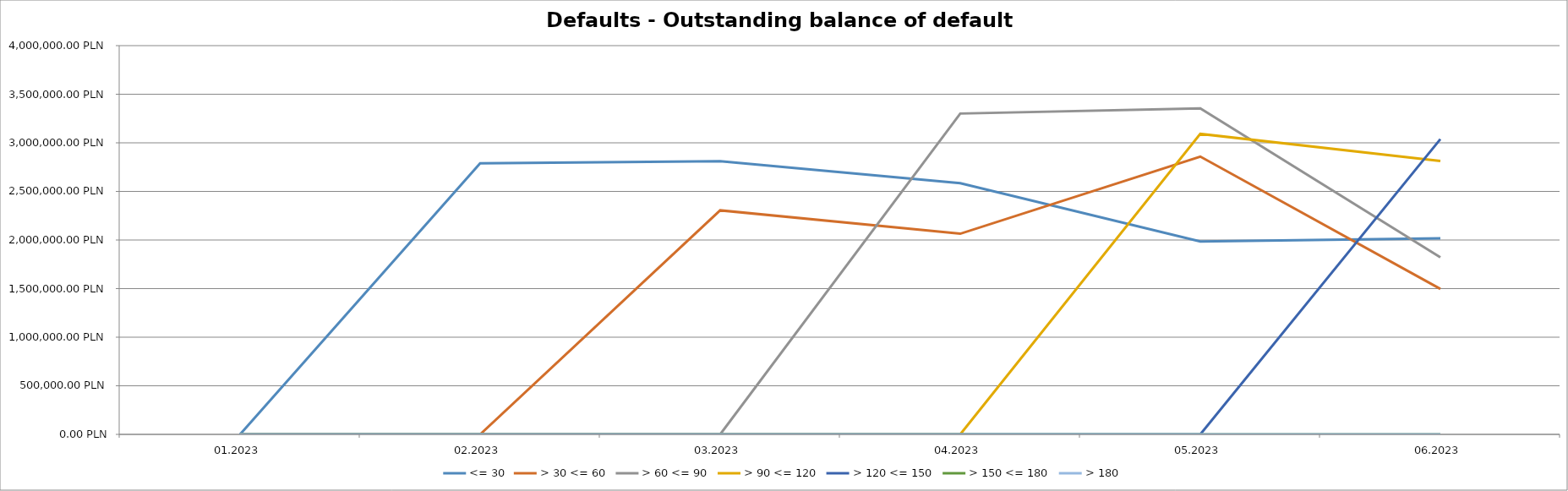
| Category | <= 30 | > 30 <= 60 | > 60 <= 90 | > 90 <= 120 | > 120 <= 150 | > 150 <= 180 | > 180 |
|---|---|---|---|---|---|---|---|
| 01.2023 | 0 | 0 | 0 | 0 | 0 | 0 | 0 |
| 02.2023 | 2788519.82 | 0 | 0 | 0 | 0 | 0 | 0 |
| 03.2023 | 2811517.14 | 2305154.07 | 0 | 0 | 0 | 0 | 0 |
| 04.2023 | 2584791.3 | 2064675.87 | 3301101.31 | 0 | 0 | 0 | 0 |
| 05.2023 | 1985441.56 | 2858398.5 | 3353485.78 | 3091988.77 | 0 | 0 | 0 |
| 06.2023 | 2016845.02 | 1496657.8 | 1822162.63 | 2812422.86 | 3037767.68 | 0 | 0 |